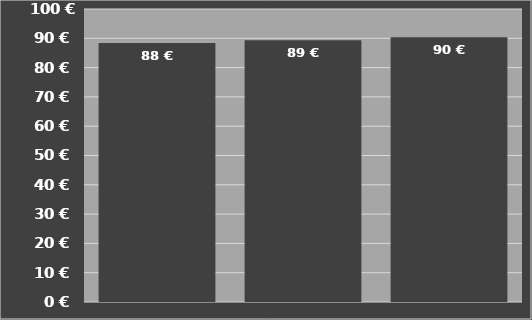
| Category | Kosten je Stunde |
|---|---|
| SIP Air 300 F Alp Bandschwader | 88.372 |
| SIP Air 300 F Alp Bandschwader | 89.371 |